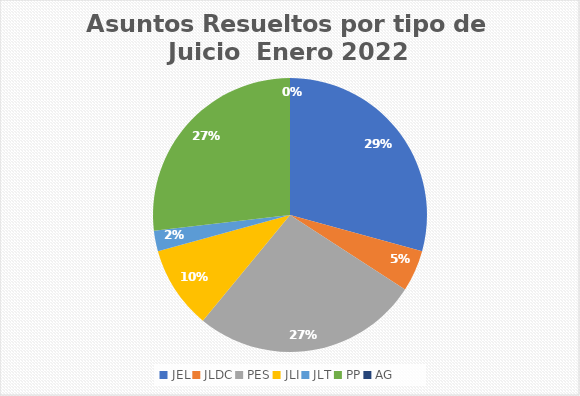
| Category | Asuntos Resueltos por tipo de Juicio  Enero |
|---|---|
| JEL | 12 |
| JLDC | 2 |
| PES | 11 |
| JLI | 4 |
| JLT | 1 |
| PP | 11 |
| AG | 0 |